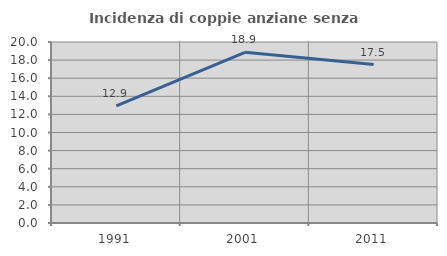
| Category | Incidenza di coppie anziane senza figli  |
|---|---|
| 1991.0 | 12.939 |
| 2001.0 | 18.864 |
| 2011.0 | 17.503 |